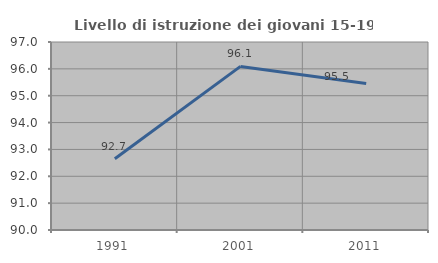
| Category | Livello di istruzione dei giovani 15-19 anni |
|---|---|
| 1991.0 | 92.65 |
| 2001.0 | 96.091 |
| 2011.0 | 95.455 |